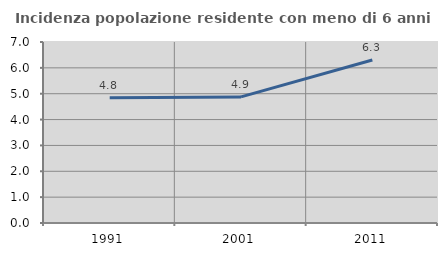
| Category | Incidenza popolazione residente con meno di 6 anni |
|---|---|
| 1991.0 | 4.844 |
| 2001.0 | 4.876 |
| 2011.0 | 6.306 |